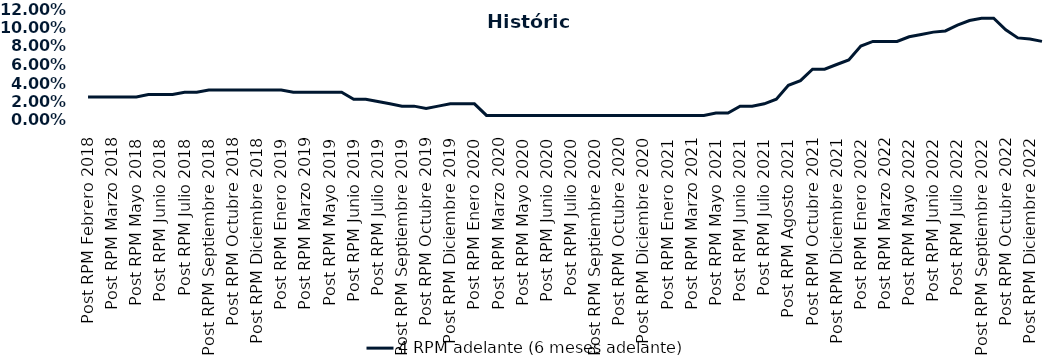
| Category | 4 RPM adelante (6 meses adelante) |
|---|---|
| Post RPM Febrero 2018 | 0.025 |
| Pre RPM Marzo 2018 | 0.025 |
| Post RPM Marzo 2018 | 0.025 |
| Pre RPM Mayo 2018 | 0.025 |
| Post RPM Mayo 2018 | 0.025 |
| Pre RPM Junio 2018 | 0.028 |
| Post RPM Junio 2018 | 0.028 |
| Pre RPM Julio 2018 | 0.028 |
| Post RPM Julio 2018 | 0.03 |
| Pre RPM Septiembre 2018 | 0.03 |
| Post RPM Septiembre 2018 | 0.032 |
| Pre RPM Octubre 2018 | 0.032 |
| Post RPM Octubre 2018 | 0.032 |
| Pre RPM Diciembre 2018 | 0.032 |
| Post RPM Diciembre 2018 | 0.032 |
| Pre RPM Enero 2019 | 0.032 |
| Post RPM Enero 2019 | 0.032 |
| Pre RPM Marzo 2019 | 0.03 |
| Post RPM Marzo 2019 | 0.03 |
| Pre RPM Mayo 2019 | 0.03 |
| Post RPM Mayo 2019 | 0.03 |
| Pre RPM Junio 2019 | 0.03 |
| Post RPM Junio 2019 | 0.022 |
| Pre RPM Julio 2019 | 0.022 |
| Post RPM Julio 2019 | 0.02 |
| Pre RPM Septiembre 2019 | 0.018 |
| Post RPM Septiembre 2019 | 0.015 |
| Pre RPM Octubre 2019 | 0.015 |
| Post RPM Octubre 2019 | 0.012 |
| Pre RPM Diciembre 2019 | 0.015 |
| Post RPM Diciembre 2019 | 0.018 |
| Pre RPM Enero 2020 | 0.018 |
| Post RPM Enero 2020 | 0.018 |
| Pre RPM Marzo 2020 | 0.005 |
| Post RPM Marzo 2020 | 0.005 |
| Pre RPM Mayo 2020 | 0.005 |
| Post RPM Mayo 2020 | 0.005 |
| Pre RPM Junio 2020 | 0.005 |
| Post RPM Junio 2020 | 0.005 |
| Pre RPM Julio 2020 | 0.005 |
| Post RPM Julio 2020 | 0.005 |
| Pre RPM Septiembre 2020 | 0.005 |
| Post RPM Septiembre 2020 | 0.005 |
| Pre RPM Octubre 2020 | 0.005 |
| Post RPM Octubre 2020 | 0.005 |
| Pre RPM Diciembre 2020 | 0.005 |
| Post RPM Diciembre 2020 | 0.005 |
| Pre RPM Enero 2021 | 0.005 |
| Post RPM Enero 2021 | 0.005 |
| Pre RPM Marzo 2021 | 0.005 |
| Post RPM Marzo 2021 | 0.005 |
| Pre RPM Mayo 2021 | 0.005 |
| Post RPM Mayo 2021 | 0.008 |
| Pre RPM Junio 2021 | 0.008 |
| Post RPM Junio 2021 | 0.015 |
| Pre RPM Julio 2021 | 0.015 |
| Post RPM Julio 2021 | 0.018 |
| Pre RPM Agosto 2021 | 0.022 |
| Post RPM Agosto 2021 | 0.038 |
| Pre RPM Octubre 2021 | 0.042 |
| Post RPM Octubre 2021 | 0.055 |
| Pre RPM Diciembre 2021 | 0.055 |
| Post RPM Diciembre 2021 | 0.06 |
| Pre RPM Enero 2022 | 0.065 |
| Post RPM Enero 2022 | 0.08 |
| Pre RPM Marzo 2022 | 0.085 |
| Post RPM Marzo 2022 | 0.085 |
| Pre RPM Mayo 2022 | 0.085 |
| Post RPM Mayo 2022 | 0.09 |
| Pre RPM Junio 2022 | 0.092 |
| Post RPM Junio 2022 | 0.095 |
| Pre RPM Julio 2022 | 0.096 |
| Post RPM Julio 2022 | 0.102 |
| Pre RPM Septiembre 2022 | 0.108 |
| Post RPM Septiembre 2022 | 0.11 |
| Pre RPM Octubre 2022 | 0.11 |
| Post RPM Octubre 2022 | 0.098 |
| Pre RPM Diciembre 2022 | 0.089 |
| Post RPM Diciembre 2022 | 0.088 |
| Pre RPM Enero 2023 | 0.085 |